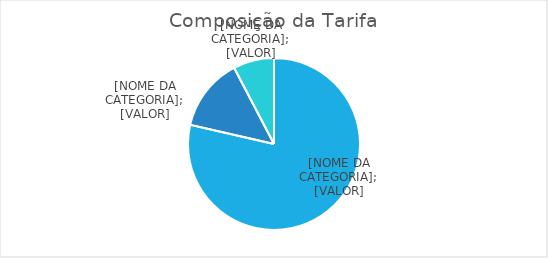
| Category | Series 0 |
|---|---|
| Tarifa P0 Água+Esgoto (TB) | 0.786 |
| Tarifa Parcela A (TA) | 0.137 |
| Compensações | 0.077 |